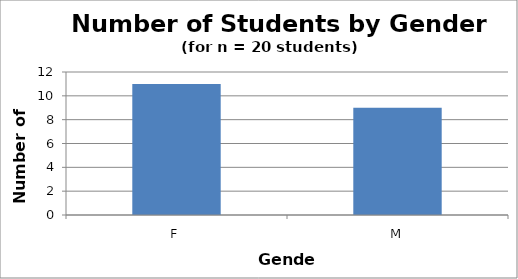
| Category | Gender |
|---|---|
| F | 11 |
| M | 9 |